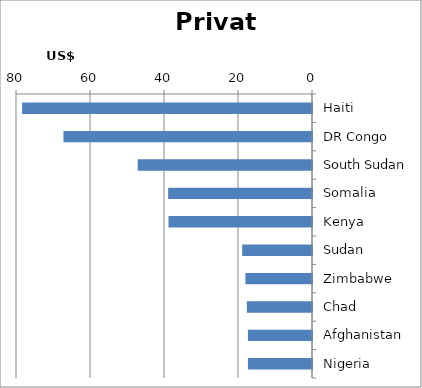
| Category | Private |
|---|---|
| Haiti | 78.359 |
| DR Congo | 67.18 |
| South Sudan | 47.114 |
| Somalia | 38.876 |
| Kenya | 38.78 |
| Sudan | 18.872 |
| Zimbabwe | 17.998 |
| Chad | 17.603 |
| Afghanistan | 17.324 |
| Nigeria | 17.321 |